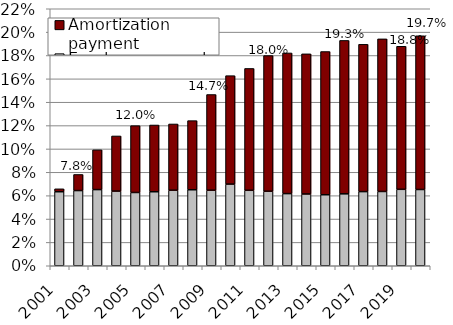
| Category | Employer normal cost | Amortization payment |
|---|---|---|
| 2001.0 | 0.063 | 0.003 |
| 2002.0 | 0.064 | 0.014 |
| 2003.0 | 0.065 | 0.034 |
| 2004.0 | 0.064 | 0.047 |
| 2005.0 | 0.063 | 0.057 |
| 2006.0 | 0.063 | 0.057 |
| 2007.0 | 0.065 | 0.057 |
| 2008.0 | 0.065 | 0.059 |
| 2009.0 | 0.065 | 0.082 |
| 2010.0 | 0.07 | 0.093 |
| 2011.0 | 0.065 | 0.104 |
| 2012.0 | 0.064 | 0.116 |
| 2013.0 | 0.062 | 0.12 |
| 2014.0 | 0.061 | 0.12 |
| 2015.0 | 0.061 | 0.123 |
| 2016.0 | 0.062 | 0.131 |
| 2017.0 | 0.063 | 0.126 |
| 2018.0 | 0.064 | 0.131 |
| 2019.0 | 0.065 | 0.122 |
| 2020.0 | 0.065 | 0.132 |